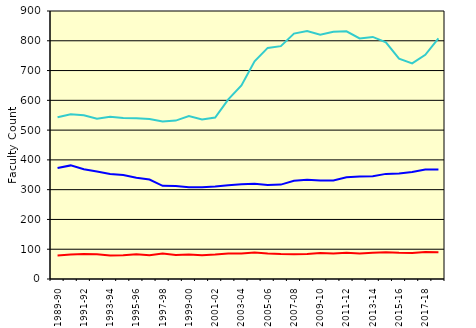
| Category | Schools of Arts, Sciences, & Engineering | Eastman School of Music | School of Medicine & Dentistry |
|---|---|---|---|
| 1989-90 | 372.5 | 79 | 543 |
| 1990-91 | 381.5 | 82 | 553 |
| 1991-92 | 368.5 | 84 | 550 |
| 1992-93 | 361 | 83 | 538 |
| 1993-94 | 353 | 79 | 545 |
| 1994-95 | 349 | 80 | 541 |
| 1995-96 | 340 | 83 | 540 |
| 1996-97 | 334 | 80 | 537 |
| 1997-98 | 313 | 86 | 529 |
| 1998-99 | 312 | 81 | 532 |
| 1999-00 | 308 | 82 | 547 |
| 2000-01 | 308 | 80 | 536 |
| 2001-02 | 311 | 82 | 542 |
| 2002-03 | 315 | 86 | 603 |
| 2003-04 | 318 | 86 | 650 |
| 2004-05 | 320 | 89 | 731 |
| 2005-06 | 316 | 86 | 776 |
| 2006-07 | 317 | 84 | 782 |
| 2007-08 | 330 | 83 | 824 |
| 2008-09 | 333 | 84 | 833 |
| 2009-10 | 331 | 87 | 820 |
| 2010-11 | 331 | 86 | 830 |
| 2011-12 | 342 | 88 | 832 |
| 2012-13 | 344 | 86 | 808 |
| 2013-14 | 345 | 88 | 813 |
| 2014-15 | 353 | 90 | 795 |
| 2015-16 | 354 | 88 | 740 |
| 2016-17 | 359 | 87 | 724 |
| 2017-18 | 368 | 91 | 753 |
| 2018-19 | 368 | 90 | 808 |